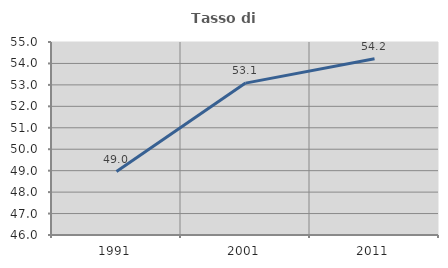
| Category | Tasso di occupazione   |
|---|---|
| 1991.0 | 48.96 |
| 2001.0 | 53.083 |
| 2011.0 | 54.219 |